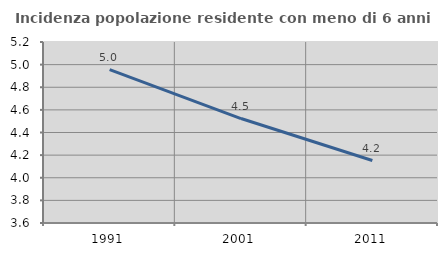
| Category | Incidenza popolazione residente con meno di 6 anni |
|---|---|
| 1991.0 | 4.956 |
| 2001.0 | 4.523 |
| 2011.0 | 4.152 |